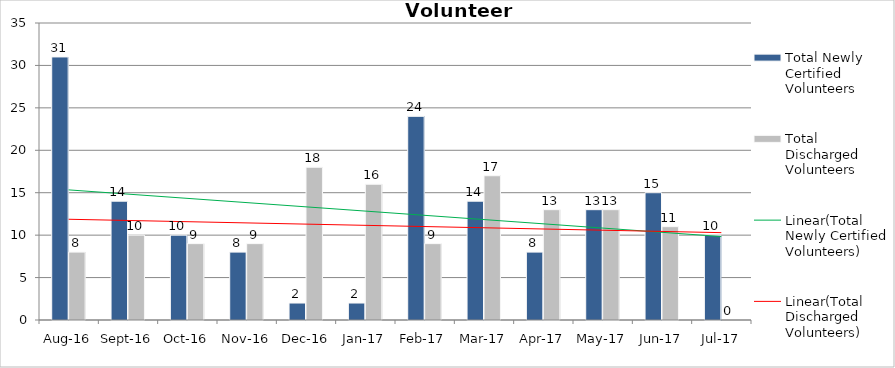
| Category | Total Newly Certified Volunteers | Total Discharged Volunteers |
|---|---|---|
| Aug-16 | 31 | 8 |
| Sep-16 | 14 | 10 |
| Oct-16 | 10 | 9 |
| Nov-16 | 8 | 9 |
| Dec-16 | 2 | 18 |
| Jan-17 | 2 | 16 |
| Feb-17 | 24 | 9 |
| Mar-17 | 14 | 17 |
| Apr-17 | 8 | 13 |
| May-17 | 13 | 13 |
| Jun-17 | 15 | 11 |
| Jul-17 | 10 | 0 |